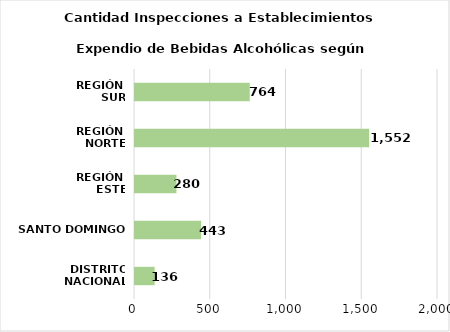
| Category | Series 0 |
|---|---|
| DISTRITO NACIONAL | 136 |
| SANTO DOMINGO | 443 |
| REGIÓN 
ESTE | 280 |
| REGIÓN 
NORTE | 1552 |
| REGIÓN 
SUR | 764 |